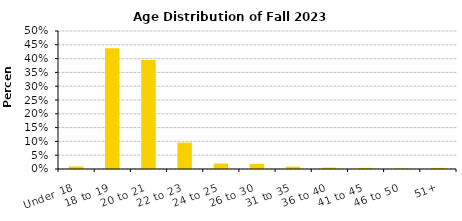
| Category | Series 0 |
|---|---|
| Under 18 | 0.009 |
| 18 to 19 | 0.438 |
| 20 to 21 | 0.395 |
| 22 to 23 | 0.096 |
| 24 to 25 | 0.02 |
| 26 to 30 | 0.019 |
| 31 to 35 | 0.008 |
| 36 to 40 | 0.005 |
| 41 to 45 | 0.004 |
| 46 to 50 | 0.002 |
| 51+ | 0.004 |